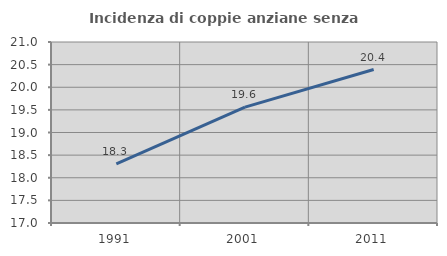
| Category | Incidenza di coppie anziane senza figli  |
|---|---|
| 1991.0 | 18.307 |
| 2001.0 | 19.56 |
| 2011.0 | 20.391 |